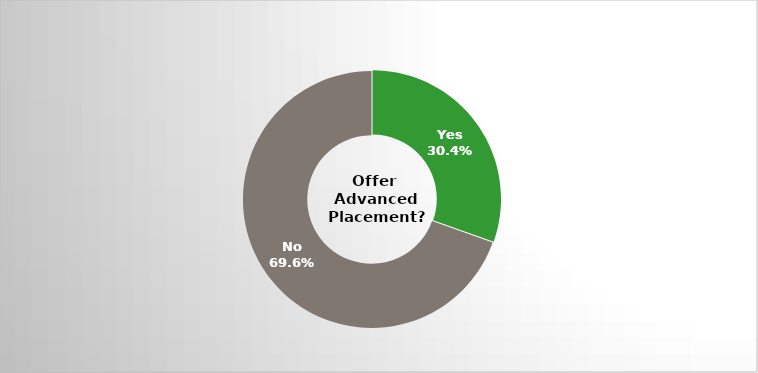
| Category | Series 0 |
|---|---|
| Yes | 0.304 |
| No | 0.696 |